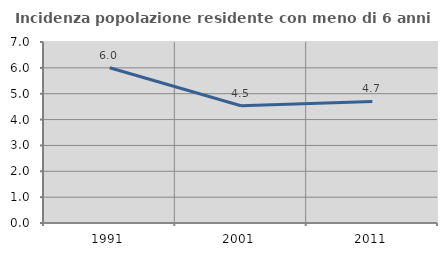
| Category | Incidenza popolazione residente con meno di 6 anni |
|---|---|
| 1991.0 | 6.005 |
| 2001.0 | 4.534 |
| 2011.0 | 4.702 |